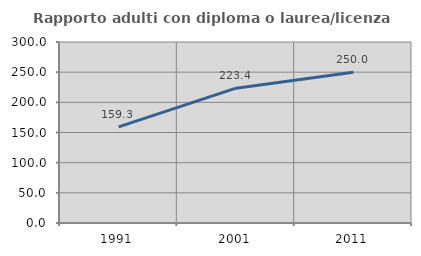
| Category | Rapporto adulti con diploma o laurea/licenza media  |
|---|---|
| 1991.0 | 159.261 |
| 2001.0 | 223.431 |
| 2011.0 | 249.966 |